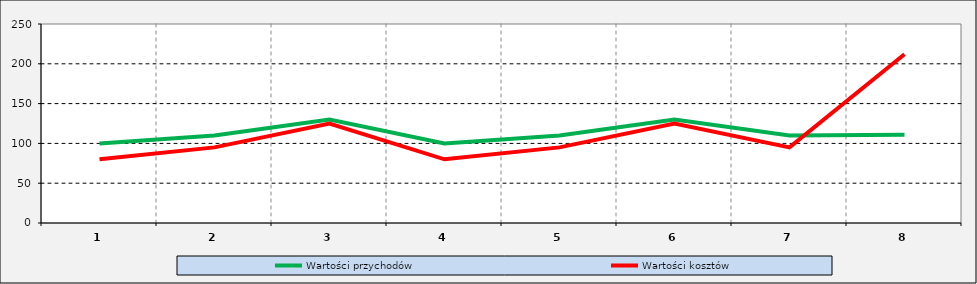
| Category | Wartości przychodów | Wartości kosztów |
|---|---|---|
| 1.0 | 100 | 80 |
| 2.0 | 110 | 95 |
| 3.0 | 130 | 125 |
| 4.0 | 100 | 80 |
| 5.0 | 110 | 95 |
| 6.0 | 130 | 125 |
| 7.0 | 110 | 95 |
| 8.0 | 111 | 212 |